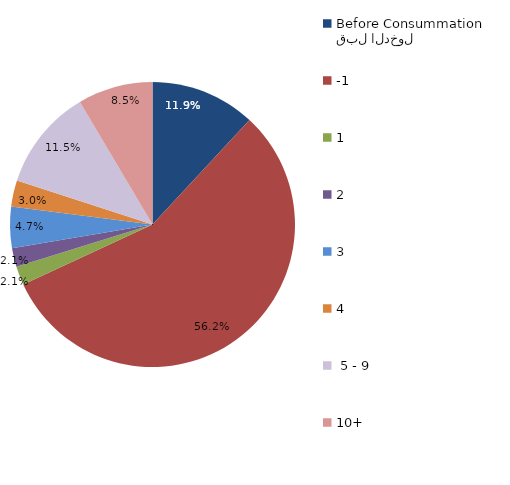
| Category | Series 0 |
|---|---|
| قبل الدخول
Before Consummation | 11.915 |
| -1 | 56.17 |
| 1 | 2.128 |
| 2 | 2.128 |
| 3 | 4.681 |
| 4 | 2.979 |
|  5 - 9 | 11.489 |
| 10+ | 8.511 |